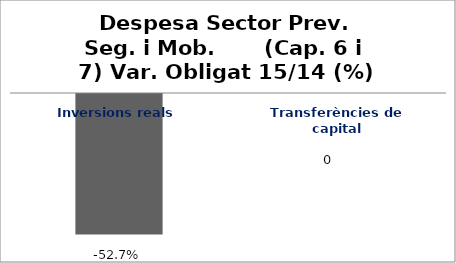
| Category | Series 0 |
|---|---|
| Inversions reals | -0.527 |
| Transferències de capital | 0 |